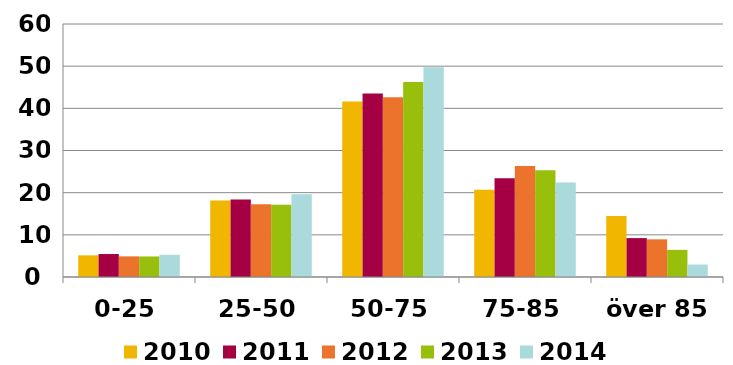
| Category | 2010 | 2011 | 2012 | 2013 | 2014 |
|---|---|---|---|---|---|
| 0-25 | 5.14 | 5.448 | 4.896 | 4.874 | 5.278 |
| 25-50 | 18.126 | 18.361 | 17.256 | 17.128 | 19.62 |
| 50-75 | 41.597 | 43.534 | 42.599 | 46.226 | 49.74 |
| 75-85 | 20.683 | 23.429 | 26.319 | 25.336 | 22.406 |
| över 85 | 14.455 | 9.227 | 8.931 | 6.436 | 2.957 |